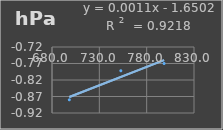
| Category | Presión Atmosférica |
|---|---|
| 698.3 | -0.88 |
| 752.7 | -0.792 |
| 798.4 | -0.77 |